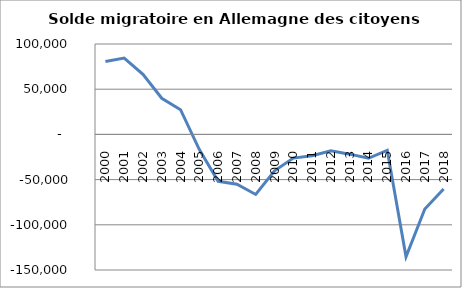
| Category | Series 0 |
|---|---|
| 2000.0 | 80665 |
| 2001.0 | 84451 |
| 2002.0 | 66519 |
| 2003.0 | 39949 |
| 2004.0 | 27326 |
| 2005.0 | -16764 |
| 2006.0 | -51902 |
| 2007.0 | -55091 |
| 2008.0 | -66428 |
| 2009.0 | -40288 |
| 2010.0 | -26248 |
| 2011.0 | -23528 |
| 2012.0 | -18204 |
| 2013.0 | -21857 |
| 2014.0 | -26441 |
| 2015.0 | -17560 |
| 2016.0 | -135364 |
| 2017.0 | -82478 |
| 2018.0 | -60320 |